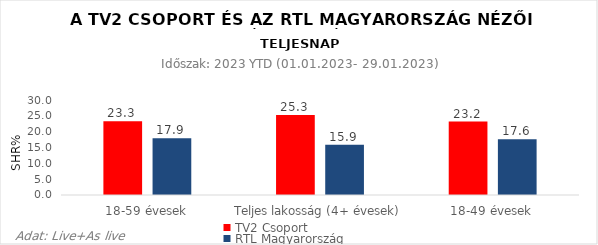
| Category | TV2 Csoport | RTL Magyarország |
|---|---|---|
| 18-59 évesek | 23.3 | 17.9 |
| Teljes lakosság (4+ évesek) | 25.3 | 15.9 |
| 18-49 évesek | 23.2 | 17.6 |